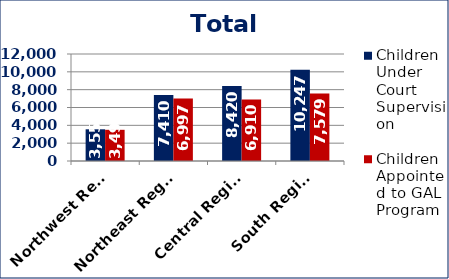
| Category | Children Under Court Supervision  | Children Appointed to GAL Program  |
|---|---|---|
| Northwest Region | 3555 | 3498 |
| Northeast Region | 7410 | 6997 |
| Central Region | 8420 | 6910 |
| South Region | 10247 | 7579 |